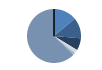
| Category | Series 0 |
|---|---|
| ARRASTRE | 139 |
| CERCO | 124 |
| PALANGRE | 73 |
| REDES DE ENMALLE | 21 |
| ARTES FIJAS | 14 |
| ARTES MENORES | 626 |
| SIN TIPO ASIGNADO | 0 |